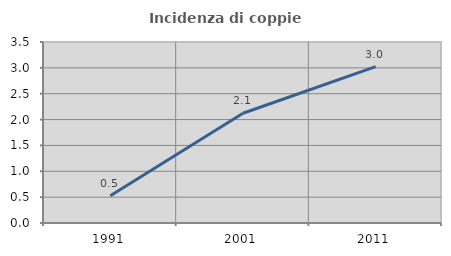
| Category | Incidenza di coppie miste |
|---|---|
| 1991.0 | 0.528 |
| 2001.0 | 2.123 |
| 2011.0 | 3.024 |